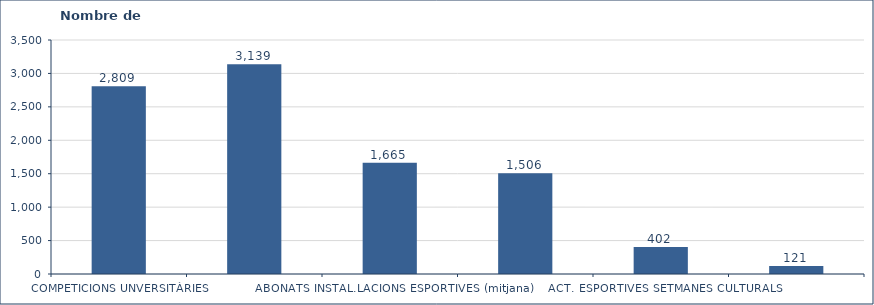
| Category | Nombre de participants |
|---|---|
| COMPETICIONS UNVERSITÀRIES | 2809 |
| PROMOCIÓ ESPORTIVA I SALUT | 3139 |
| ABONATS INSTAL.LACIONS ESPORTIVES (mitjana) | 1665 |
| ACT. DIRIGIDES  (mitjana/mes) | 1506 |
| ACT. ESPORTIVES SETMANES CULTURALS | 402 |
| PROGRAMA ESPORTISTES ALT NIVELL UPC | 121 |